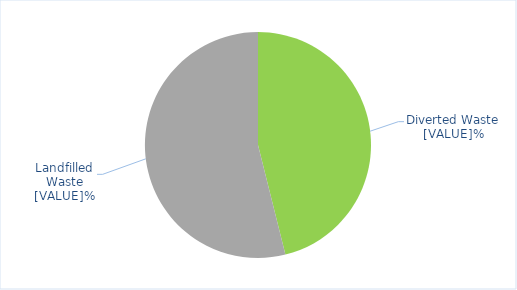
| Category | Series 0 |
|---|---|
| 0 | 46.1 |
| 1 | 53.9 |